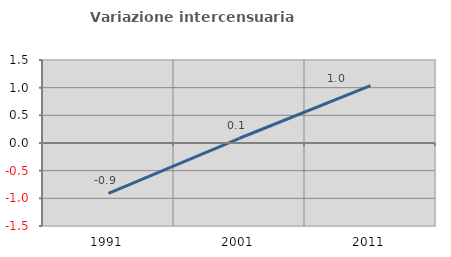
| Category | Variazione intercensuaria annua |
|---|---|
| 1991.0 | -0.908 |
| 2001.0 | 0.086 |
| 2011.0 | 1.036 |